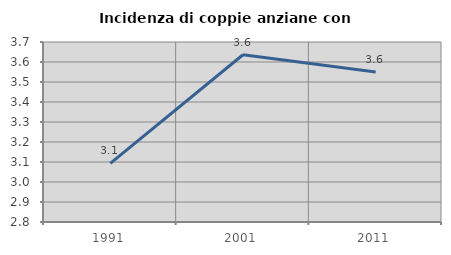
| Category | Incidenza di coppie anziane con figli |
|---|---|
| 1991.0 | 3.093 |
| 2001.0 | 3.636 |
| 2011.0 | 3.55 |